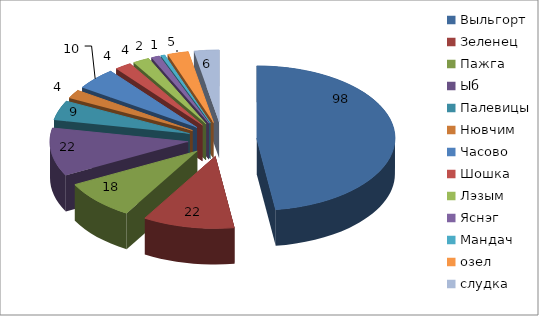
| Category | Series 0 |
|---|---|
| Выльгорт | 98 |
| Зеленец | 22 |
| Пажга | 18 |
| Ыб | 22 |
| Палевицы | 9 |
| Нювчим | 4 |
| Часово | 10 |
| Шошка | 4 |
| Лэзым | 4 |
| Яснэг | 2 |
| Мандач | 1 |
| озел | 5 |
| слудка | 6 |